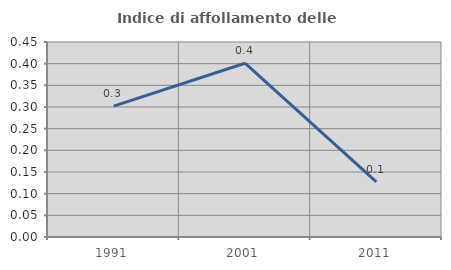
| Category | Indice di affollamento delle abitazioni  |
|---|---|
| 1991.0 | 0.302 |
| 2001.0 | 0.401 |
| 2011.0 | 0.127 |